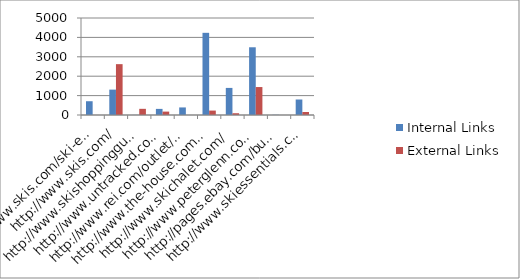
| Category | Internal Links | External Links |
|---|---|---|
| http://www.skis.com/ski-equipment/c9/ | 710 | 2 |
| http://www.skis.com/ | 1308 | 2621 |
| http://www.skishoppingguide.com/ | 4 | 318 |
| http://www.untracked.com/ | 315 | 175 |
| http://www.rei.com/outlet/category/22000078 | 390 | 0 |
| http://www.the-house.com/skis.html | 4236 | 228 |
| http://www.skichalet.com/ | 1396 | 91 |
| http://www.peterglenn.com/ | 3491 | 1441 |
| http://pages.ebay.com/buy/guides/skis-skiing-equipment-buying-guide/ | 10 | 0 |
| http://www.skiessentials.com/ | 799 | 154 |